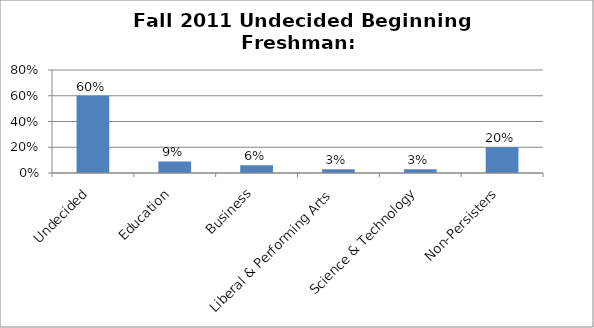
| Category | Series 0 |
|---|---|
| Undecided | 0.6 |
| Education | 0.09 |
| Business | 0.06 |
| Liberal & Performing Arts | 0.03 |
| Science & Technology | 0.03 |
| Non-Persisters | 0.2 |